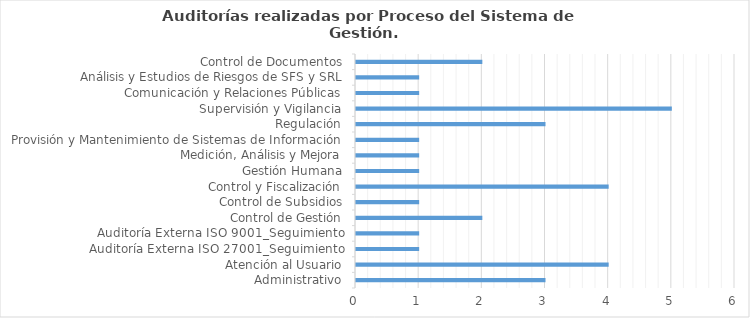
| Category | Total |
|---|---|
| Administrativo | 3 |
| Atención al Usuario | 4 |
| Auditoría Externa ISO 27001_Seguimiento | 1 |
| Auditoría Externa ISO 9001_Seguimiento | 1 |
| Control de Gestión | 2 |
| Control de Subsidios | 1 |
| Control y Fiscalización | 4 |
| Gestión Humana | 1 |
| Medición, Análisis y Mejora | 1 |
| Provisión y Mantenimiento de Sistemas de Información | 1 |
| Regulación | 3 |
| Supervisión y Vigilancia | 5 |
| Comunicación y Relaciones Públicas | 1 |
| Análisis y Estudios de Riesgos de SFS y SRL | 1 |
| Control de Documentos | 2 |